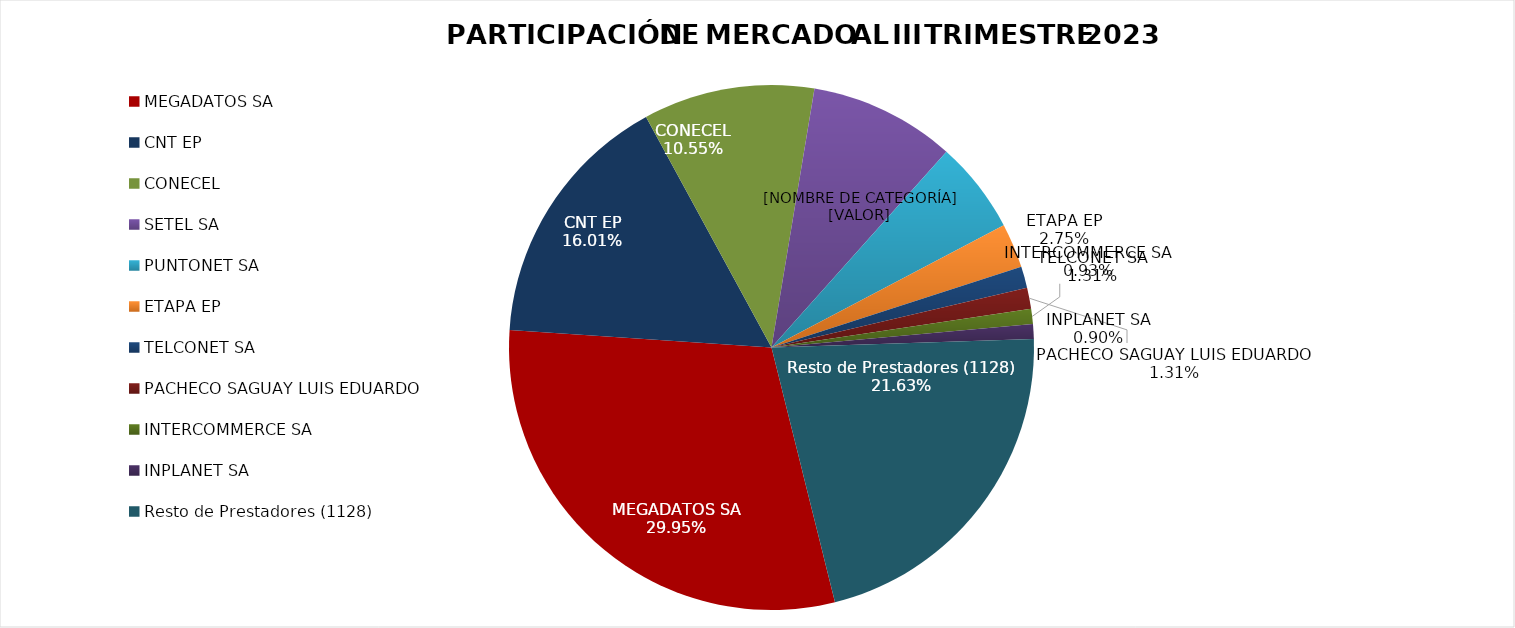
| Category | Series 0 |
|---|---|
| MEGADATOS SA | 0.3 |
| CNT EP | 0.16 |
| CONECEL | 0.106 |
| SETEL SA | 0.09 |
| PUNTONET SA | 0.057 |
| ETAPA EP | 0.027 |
| TELCONET SA | 0.013 |
| PACHECO SAGUAY LUIS EDUARDO | 0.013 |
| INTERCOMMERCE SA | 0.009 |
| INPLANET SA | 0.009 |
| Resto de Prestadores (1128) | 0.216 |